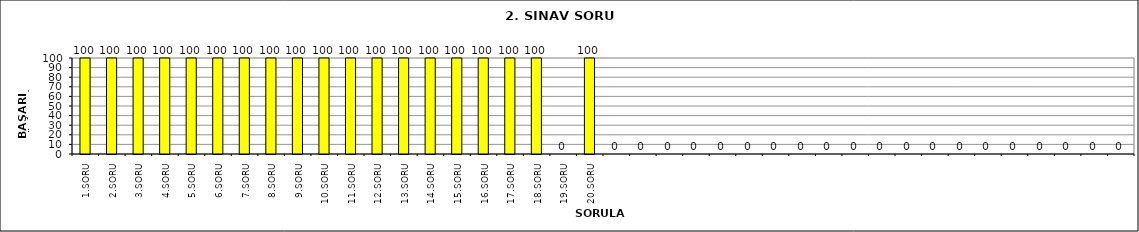
| Category | Series 0 |
|---|---|
| 1.SORU | 100 |
| 2.SORU | 100 |
| 3.SORU | 100 |
| 4.SORU | 100 |
| 5.SORU | 100 |
| 6.SORU | 100 |
| 7.SORU | 100 |
| 8.SORU | 100 |
| 9.SORU | 100 |
| 10.SORU | 100 |
| 11.SORU | 100 |
| 12.SORU | 100 |
| 13.SORU | 100 |
| 14.SORU | 100 |
| 15.SORU | 100 |
| 16.SORU | 100 |
| 17.SORU | 100 |
| 18.SORU | 100 |
| 19.SORU | 0 |
| 20.SORU | 100 |
|   | 0 |
|   | 0 |
|   | 0 |
|   | 0 |
|   | 0 |
|   | 0 |
|   | 0 |
|   | 0 |
|   | 0 |
|   | 0 |
|   | 0 |
|   | 0 |
|   | 0 |
|   | 0 |
|   | 0 |
|   | 0 |
|   | 0 |
|   | 0 |
|   | 0 |
|   | 0 |